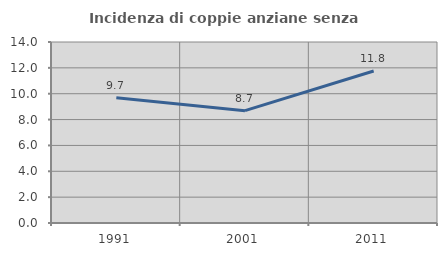
| Category | Incidenza di coppie anziane senza figli  |
|---|---|
| 1991.0 | 9.691 |
| 2001.0 | 8.687 |
| 2011.0 | 11.755 |